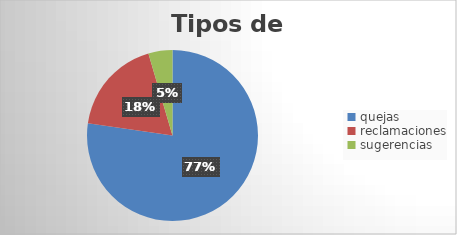
| Category | Series 0 |
|---|---|
| quejas  | 17 |
| reclamaciones | 4 |
| sugerencias | 1 |